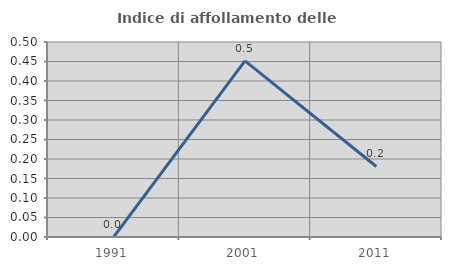
| Category | Indice di affollamento delle abitazioni  |
|---|---|
| 1991.0 | 0 |
| 2001.0 | 0.451 |
| 2011.0 | 0.181 |